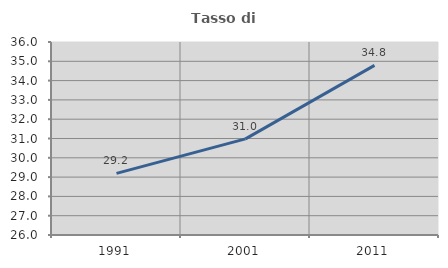
| Category | Tasso di occupazione   |
|---|---|
| 1991.0 | 29.191 |
| 2001.0 | 30.979 |
| 2011.0 | 34.791 |